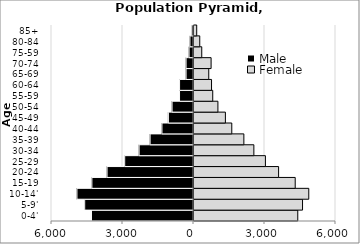
| Category | Male | Female |
|---|---|---|
| 0-4' | -4310.58 | 4384.93 |
| 5-9' | -4597.35 | 4586.48 |
| 10-14' | -4924.9 | 4849.27 |
| 15-19 | -4293.57 | 4276.79 |
| 20-24 | -3652.35 | 3574.59 |
| 25-29 | -2907.3 | 3017.6 |
| 30-34 | -2298.65 | 2529.7 |
| 35-39 | -1833.65 | 2107.29 |
| 40-44 | -1333.32 | 1596.83 |
| 45-49 | -1061.62 | 1326.78 |
| 50-54 | -905.85 | 1010.18 |
| 55-59 | -589.78 | 792.04 |
| 60-64 | -588.57 | 741.19 |
| 65-69 | -314.02 | 623.26 |
| 70-74 | -314.12 | 722.7 |
| 75-59 | -188.14 | 327.49 |
| 80-84 | -150.42 | 243.03 |
| 85+ | -75.08 | 114.41 |